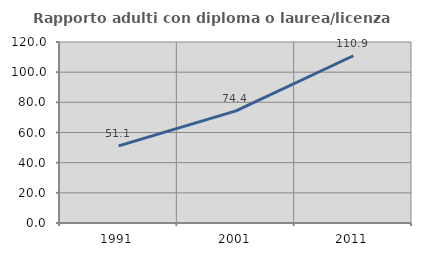
| Category | Rapporto adulti con diploma o laurea/licenza media  |
|---|---|
| 1991.0 | 51.121 |
| 2001.0 | 74.362 |
| 2011.0 | 110.873 |